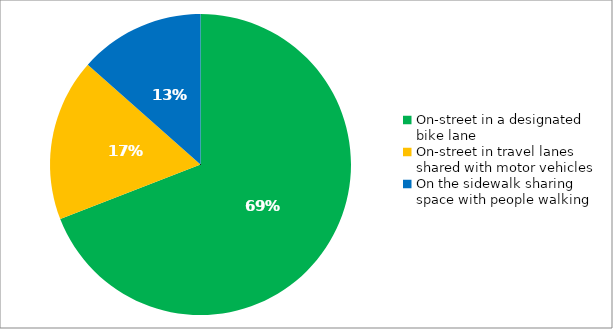
| Category | Responses |
|---|---|
| On-street in a designated bike lane | 0.691 |
| On-street in travel lanes shared with motor vehicles | 0.174 |
| On the sidewalk sharing space with people walking | 0.135 |